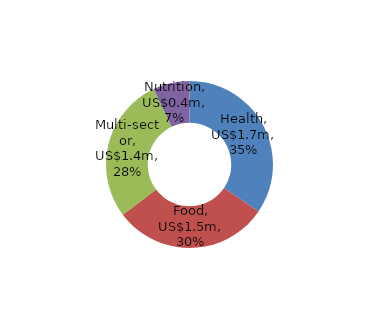
| Category | US$ m |
|---|---|
| Health | 1.712 |
| Food | 1.5 |
| Multi-sector | 1.4 |
| Nutrition | 0.35 |